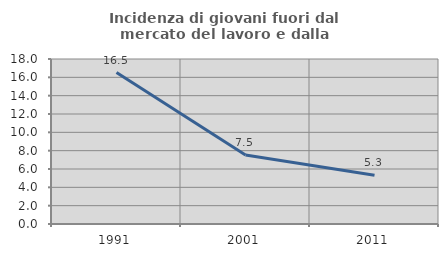
| Category | Incidenza di giovani fuori dal mercato del lavoro e dalla formazione  |
|---|---|
| 1991.0 | 16.522 |
| 2001.0 | 7.527 |
| 2011.0 | 5.319 |